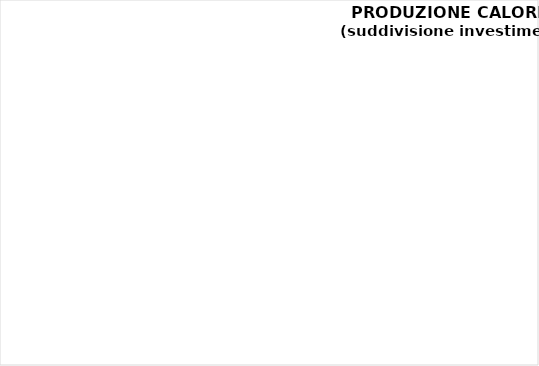
| Category | Series 0 |
|---|---|
| Opere civili | 0 |
| Impianto elettrico | 0 |
| Caldaia principale (no opere civili) | 0 |
| caldaia secondaria | 0 |
| Impiantistica per la distribuzione | 0 |
| altro | 0 |